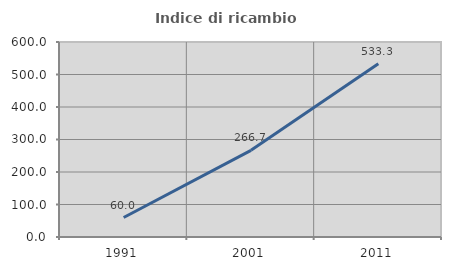
| Category | Indice di ricambio occupazionale  |
|---|---|
| 1991.0 | 60 |
| 2001.0 | 266.667 |
| 2011.0 | 533.333 |